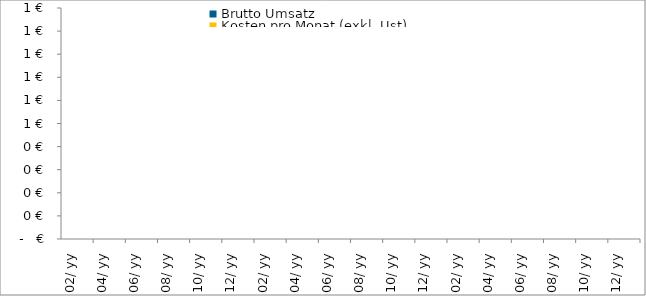
| Category | Brutto Umsatz | Kosten pro Monat (exkl. Ust) | Gewinn / Verlust (mit Abschreibungen) |
|---|---|---|---|
| 2019-02-01 | 0 | 0 | 0 |
| 2019-03-01 | 0 | 0 | 0 |
| 2019-04-01 | 0 | 0 | 0 |
| 2019-05-01 | 0 | 0 | 0 |
| 2019-06-01 | 0 | 0 | 0 |
| 2019-07-01 | 0 | 0 | 0 |
| 2019-08-01 | 0 | 0 | 0 |
| 2019-09-01 | 0 | 0 | 0 |
| 2019-10-01 | 0 | 0 | 0 |
| 2019-11-01 | 0 | 0 | 0 |
| 2019-12-01 | 0 | 0 | 0 |
| 2020-01-01 | 0 | 0 | 0 |
| 2020-02-01 | 0 | 0 | 0 |
| 2020-03-01 | 0 | 0 | 0 |
| 2020-04-01 | 0 | 0 | 0 |
| 2020-05-01 | 0 | 0 | 0 |
| 2020-06-01 | 0 | 0 | 0 |
| 2020-07-01 | 0 | 0 | 0 |
| 2020-08-01 | 0 | 0 | 0 |
| 2020-09-01 | 0 | 0 | 0 |
| 2020-10-01 | 0 | 0 | 0 |
| 2020-11-01 | 0 | 0 | 0 |
| 2020-12-01 | 0 | 0 | 0 |
| 2021-01-01 | 0 | 0 | 0 |
| 2021-02-01 | 0 | 0 | 0 |
| 2021-03-01 | 0 | 0 | 0 |
| 2021-04-01 | 0 | 0 | 0 |
| 2021-05-01 | 0 | 0 | 0 |
| 2021-06-01 | 0 | 0 | 0 |
| 2021-07-01 | 0 | 0 | 0 |
| 2021-08-01 | 0 | 0 | 0 |
| 2021-09-01 | 0 | 0 | 0 |
| 2021-10-01 | 0 | 0 | 0 |
| 2021-11-01 | 0 | 0 | 0 |
| 2021-12-01 | 0 | 0 | 0 |
| 2022-01-01 | 0 | 0 | 0 |